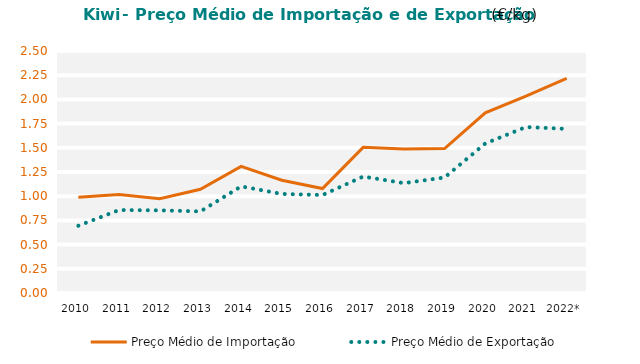
| Category | Preço Médio de Importação | Preço Médio de Exportação |
|---|---|---|
| 2010 | 0.988 | 0.695 |
| 2011 | 1.018 | 0.857 |
| 2012 | 0.973 | 0.854 |
| 2013 | 1.071 | 0.843 |
| 2014 | 1.308 | 1.101 |
| 2015 | 1.165 | 1.024 |
| 2016 | 1.079 | 1.012 |
| 2017 | 1.505 | 1.203 |
| 2018 | 1.487 | 1.135 |
| 2019 | 1.492 | 1.193 |
| 2020 | 1.86 | 1.544 |
| 2021 | 2.033 | 1.715 |
| 2022* | 2.217 | 1.696 |